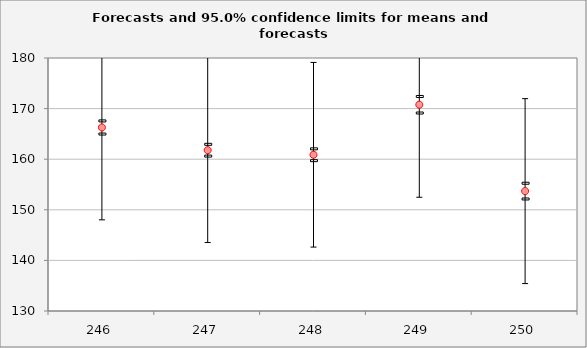
| Category | Forecast | Upper95%M | Lower95%M |
|---|---|---|---|
| 246.0 | 166.271 | 167.568 | 164.973 |
| 247.0 | 161.779 | 162.942 | 160.615 |
| 248.0 | 160.88 | 162.049 | 159.712 |
| 249.0 | 170.762 | 172.396 | 169.128 |
| 250.0 | 153.694 | 155.248 | 152.139 |